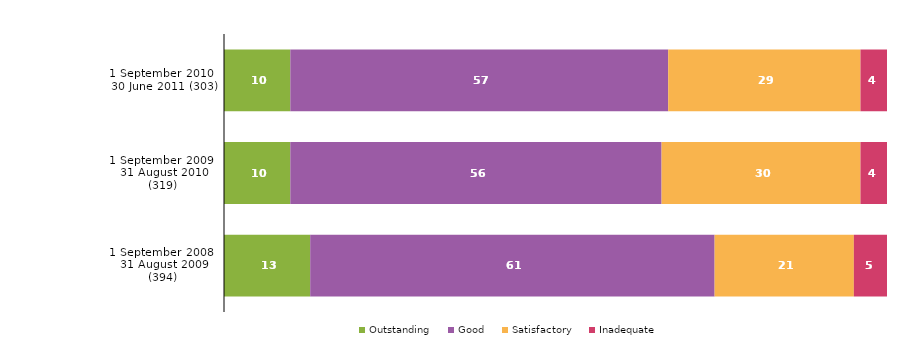
| Category | Outstanding | Good | Satisfactory | Inadequate |
|---|---|---|---|---|
| 1 September 2010 - 30 June 2011 (303) | 10 | 57 | 29 | 4 |
| 1 September 2009 - 31 August 2010 (319) | 10 | 56 | 30 | 4 |
| 1 September 2008 - 31 August 2009 (394) | 13 | 61 | 21 | 5 |